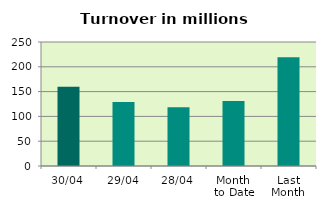
| Category | Series 0 |
|---|---|
| 30/04 | 159.993 |
| 29/04 | 129.257 |
| 28/04 | 118.513 |
| Month 
to Date | 131.238 |
| Last
Month | 219.362 |